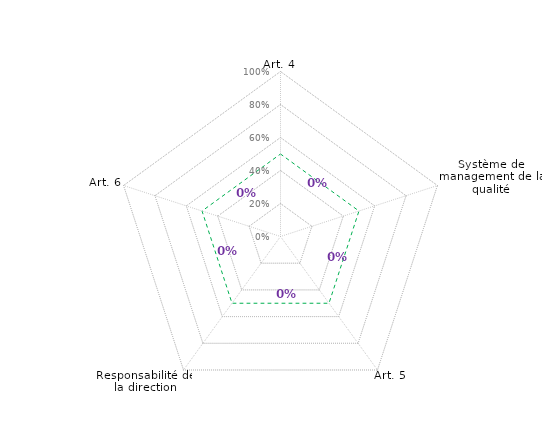
| Category | Tracage de la limite de CONFORMITÉ | Series 0 |
|---|---|---|
| 0 | 0.5 | 0 |
| 1 | 0.5 | 0 |
| 2 | 0.5 | 0 |
| 3 | 0.5 | 0 |
| 4 | 0.5 | 0 |